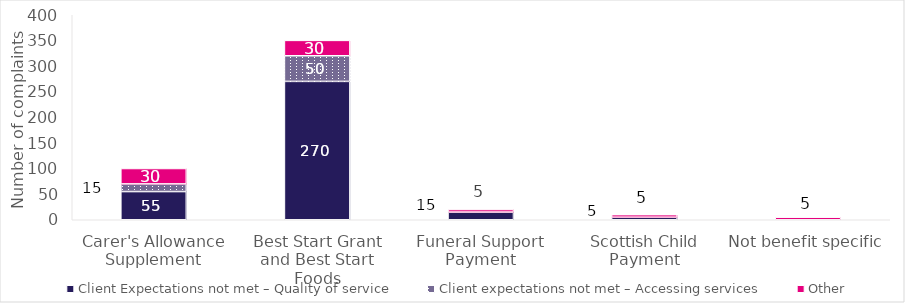
| Category | Client Expectations not met – Quality of service | Client expectations not met – Accessing services | Other |
|---|---|---|---|
| Carer's Allowance Supplement | 55 | 15 | 30 |
| Best Start Grant and Best Start Foods | 270 | 50 | 30 |
| Funeral Support Payment | 15 | 0 | 5 |
| Scottish Child Payment | 5 | 0 | 5 |
| Not benefit specific | 0 | 0 | 5 |